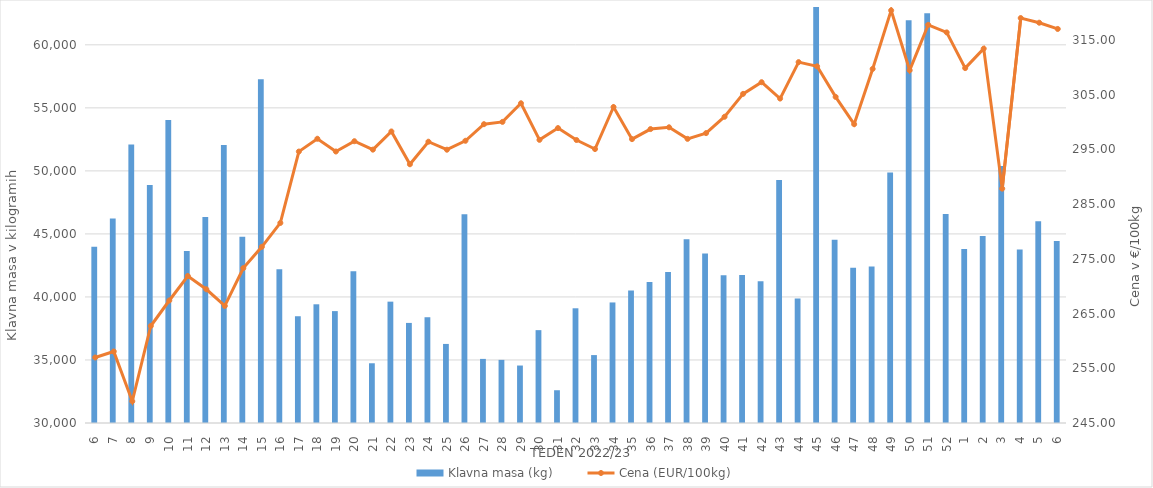
| Category | Klavna masa (kg) |
|---|---|
| 6.0 | 43982 |
| 7.0 | 46227 |
| 8.0 | 52099 |
| 9.0 | 48872 |
| 10.0 | 54045 |
| 11.0 | 43645 |
| 12.0 | 46350 |
| 13.0 | 52061 |
| 14.0 | 44774 |
| 15.0 | 57268 |
| 16.0 | 42191 |
| 17.0 | 38469 |
| 18.0 | 39417 |
| 19.0 | 38876 |
| 20.0 | 42047 |
| 21.0 | 34739 |
| 22.0 | 39626 |
| 23.0 | 37939 |
| 24.0 | 38390 |
| 25.0 | 36272 |
| 26.0 | 46553 |
| 27.0 | 35085 |
| 28.0 | 35007 |
| 29.0 | 34559 |
| 30.0 | 37366 |
| 31.0 | 32599 |
| 32.0 | 39100 |
| 33.0 | 35388 |
| 34.0 | 39563 |
| 35.0 | 40507 |
| 36.0 | 41176 |
| 37.0 | 41983 |
| 38.0 | 44572 |
| 39.0 | 43447 |
| 40.0 | 41711 |
| 41.0 | 41736 |
| 42.0 | 41239 |
| 43.0 | 49284 |
| 44.0 | 39877 |
| 45.0 | 63668 |
| 46.0 | 44528 |
| 47.0 | 42319 |
| 48.0 | 42416 |
| 49.0 | 49873 |
| 50.0 | 61942 |
| 51.0 | 62514 |
| 52.0 | 46589 |
| 1.0 | 43807 |
| 2.0 | 44834 |
| 3.0 | 50386 |
| 4.0 | 43773 |
| 5.0 | 46011 |
| 6.0 | 44439 |